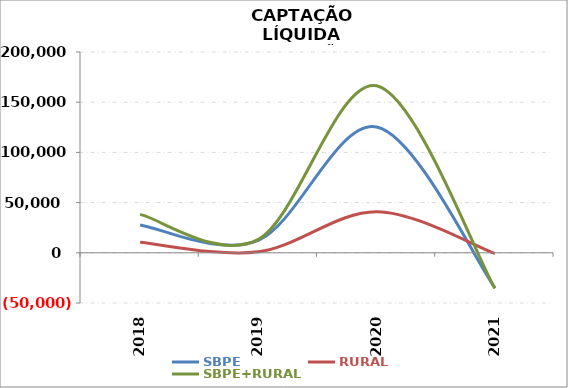
| Category | SBPE | RURAL | SBPE+RURAL |
|---|---|---|---|
| 2018 | 27791.076 | 10469.293 | 38260.369 |
| 2019 | 12389.575 | 937.497 | 13327.072 |
| 2020 | 125352.739 | 40957.163 | 166309.902 |
| 2021 | -34755.497 | -741.413 | -35496.91 |